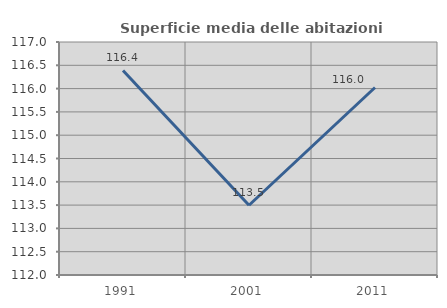
| Category | Superficie media delle abitazioni occupate |
|---|---|
| 1991.0 | 116.39 |
| 2001.0 | 113.497 |
| 2011.0 | 116.023 |